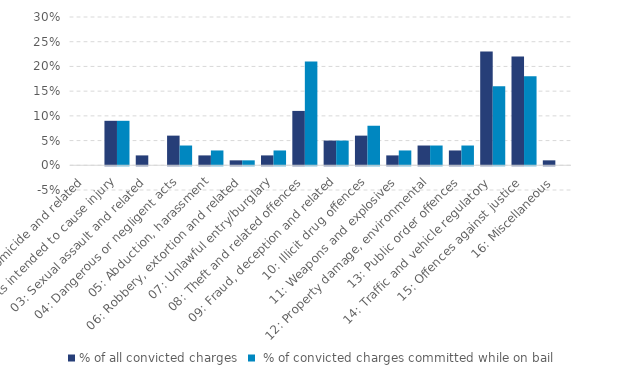
| Category | % of all convicted charges |  % of convicted charges committed while on bail |
|---|---|---|
| 01: Homicide and related | 0 | 0 |
| 02: Acts intended to cause injury | 0.09 | 0.09 |
| 03: Sexual assault and related | 0.02 | 0 |
| 04: Dangerous or negligent acts | 0.06 | 0.04 |
| 05: Abduction, harassment | 0.02 | 0.03 |
| 06: Robbery, extortion and related | 0.01 | 0.01 |
| 07: Unlawful entry/burglary | 0.02 | 0.03 |
| 08: Theft and related offences | 0.11 | 0.21 |
| 09: Fraud, deception and related | 0.05 | 0.05 |
| 10: Illicit drug offences | 0.06 | 0.08 |
| 11: Weapons and explosives | 0.02 | 0.03 |
| 12: Property damage, environmental | 0.04 | 0.04 |
| 13: Public order offences | 0.03 | 0.04 |
| 14: Traffic and vehicle regulatory | 0.23 | 0.16 |
| 15: Offences against justice | 0.22 | 0.18 |
| 16: Miscellaneous | 0.01 | 0 |